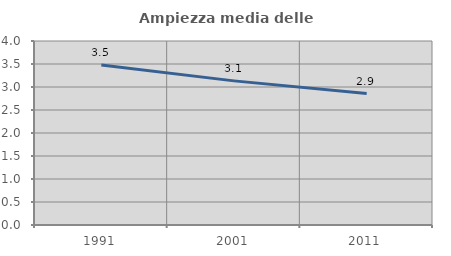
| Category | Ampiezza media delle famiglie |
|---|---|
| 1991.0 | 3.476 |
| 2001.0 | 3.133 |
| 2011.0 | 2.857 |